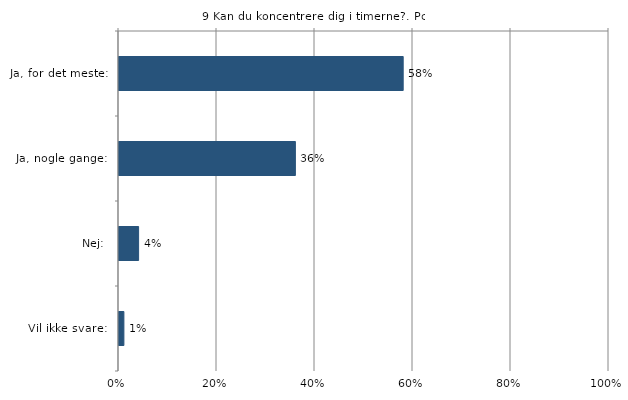
| Category | Kan du koncentrere dig i timerne? |
|---|---|
| Ja, for det meste:  | 0.58 |
| Ja, nogle gange:  | 0.36 |
| Nej:  | 0.04 |
| Vil ikke svare:  | 0.01 |